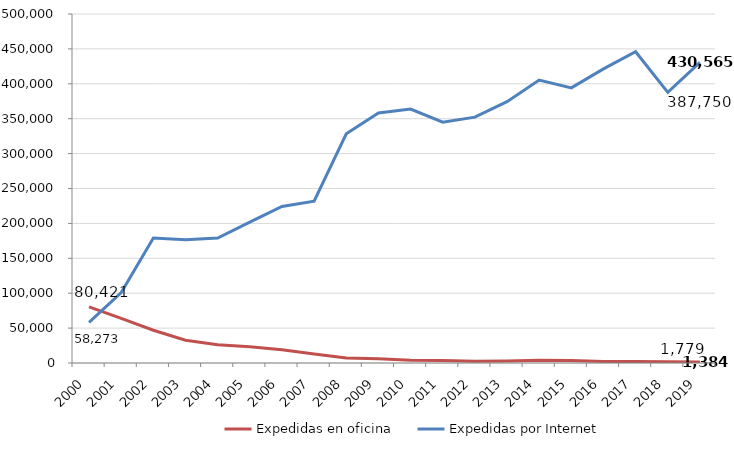
| Category | Expedidas en oficina | Expedidas por Internet |
|---|---|---|
| 2000.0 | 80421 | 58273 |
| 2001.0 | 64042 | 100869 |
| 2002.0 | 46964 | 178952 |
| 2003.0 | 32720 | 176407 |
| 2004.0 | 26096 | 179107 |
| 2005.0 | 23372 | 201707 |
| 2006.0 | 19115 | 224257 |
| 2007.0 | 12845 | 231868 |
| 2008.0 | 7134 | 328456 |
| 2009.0 | 6070 | 358211 |
| 2010.0 | 3978 | 363757 |
| 2011.0 | 3529 | 344978 |
| 2012.0 | 2560 | 352242 |
| 2013.0 | 2858 | 374439 |
| 2014.0 | 3882 | 405297 |
| 2015.0 | 3470 | 394167 |
| 2016.0 | 2312 | 421304 |
| 2017.0 | 1988 | 445939 |
| 2018.0 | 1779 | 387750 |
| 2019.0 | 1384 | 430565 |